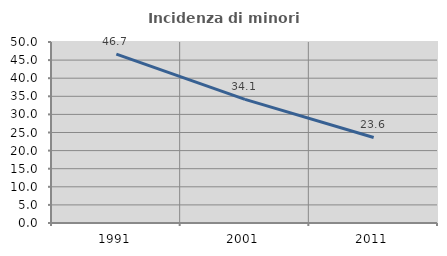
| Category | Incidenza di minori stranieri |
|---|---|
| 1991.0 | 46.667 |
| 2001.0 | 34.146 |
| 2011.0 | 23.629 |